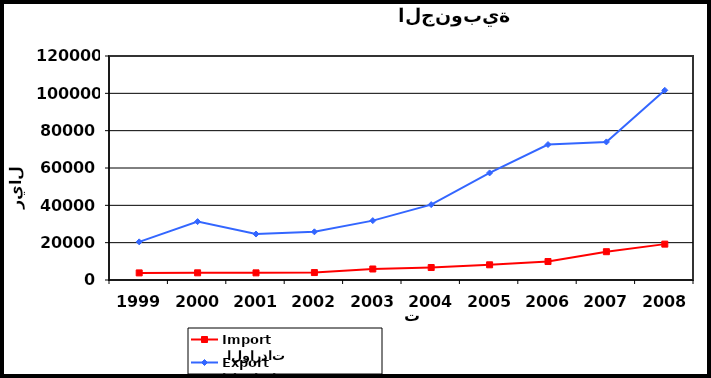
| Category |  الواردات           Import | الصادرات          Export |
|---|---|---|
| 1999.0 | 3801 | 20429 |
| 2000.0 | 3846 | 31273 |
| 2001.0 | 3831 | 24621 |
| 2002.0 | 3989 | 25813 |
| 2003.0 | 5897 | 31816 |
| 2004.0 | 6688 | 40382 |
| 2005.0 | 8138 | 57368 |
| 2006.0 | 9900 | 72570 |
| 2007.0 | 15162 | 73972 |
| 2008.0 | 19218 | 101621 |